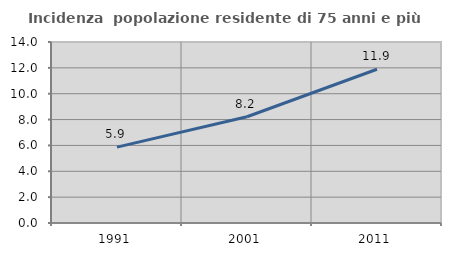
| Category | Incidenza  popolazione residente di 75 anni e più |
|---|---|
| 1991.0 | 5.868 |
| 2001.0 | 8.219 |
| 2011.0 | 11.892 |